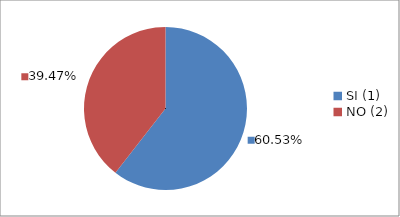
| Category | Series 0 |
|---|---|
| SI (1) | 0.605 |
| NO (2) | 0.395 |